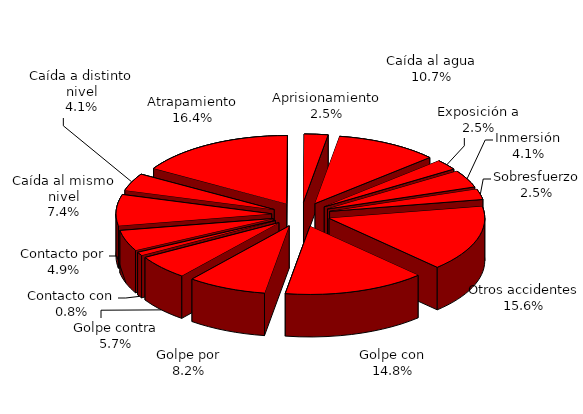
| Category | Series 0 |
|---|---|
| Golpe con | 18 |
| Golpe por | 10 |
| Golpe contra | 7 |
| Contacto con | 1 |
| Contacto por | 6 |
| Caída al mismo nivel | 9 |
| Caída a distinto nivel | 5 |
| Atrapamiento | 20 |
| Aprisionamiento | 3 |
| Caída al agua | 13 |
| Exposición a | 3 |
| Inmersión | 5 |
| Sobresfuerzo | 3 |
| Otros accidentes | 19 |